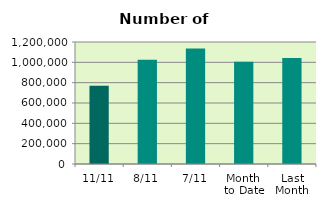
| Category | Series 0 |
|---|---|
| 11/11 | 769004 |
| 8/11 | 1025098 |
| 7/11 | 1136184 |
| Month 
to Date | 1006351.714 |
| Last
Month | 1042648 |